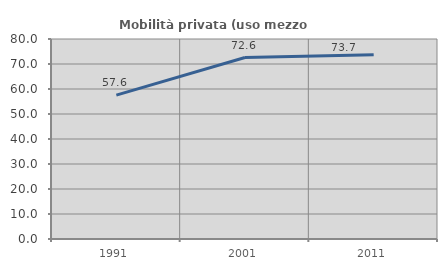
| Category | Mobilità privata (uso mezzo privato) |
|---|---|
| 1991.0 | 57.56 |
| 2001.0 | 72.575 |
| 2011.0 | 73.717 |